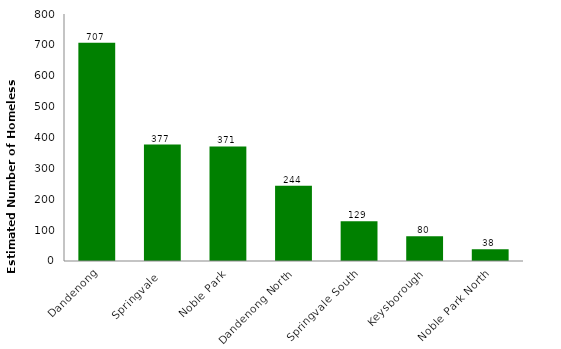
| Category | Series 0 |
|---|---|
| Dandenong | 707 |
| Springvale  | 377 |
| Noble Park | 371 |
| Dandenong North | 244 |
| Springvale South | 129 |
| Keysborough | 80 |
| Noble Park North | 38 |